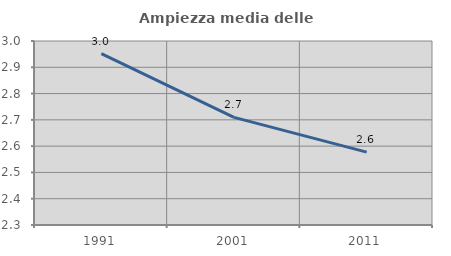
| Category | Ampiezza media delle famiglie |
|---|---|
| 1991.0 | 2.952 |
| 2001.0 | 2.71 |
| 2011.0 | 2.577 |